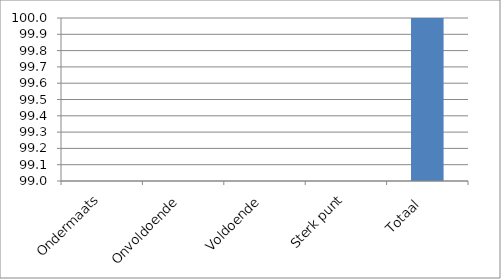
| Category | Series 0 |
|---|---|
| Ondermaats | 0 |
| Onvoldoende | 0 |
| Voldoende | 0 |
| Sterk punt | 0 |
| Totaal  | 100 |